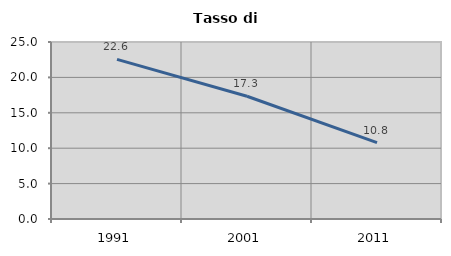
| Category | Tasso di disoccupazione   |
|---|---|
| 1991.0 | 22.55 |
| 2001.0 | 17.337 |
| 2011.0 | 10.789 |